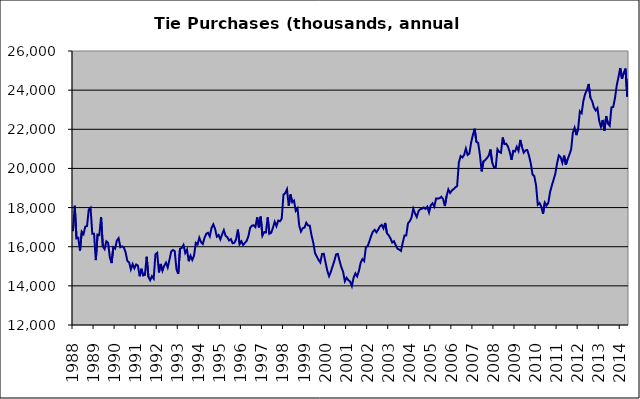
| Category | Series 0 |
|---|---|
| 1988.0 | 16794 |
| nan | 18096 |
| nan | 16425 |
| nan | 16454 |
| nan | 15802 |
| nan | 16769 |
| nan | 16644 |
| nan | 17028 |
| nan | 17057 |
| nan | 17905 |
| nan | 17995 |
| nan | 16665 |
| 1989.0 | 16665 |
| nan | 15316 |
| nan | 16619 |
| nan | 16593 |
| nan | 17519 |
| nan | 16026 |
| nan | 15879 |
| nan | 16277 |
| nan | 16203 |
| nan | 15461 |
| nan | 15163 |
| nan | 15972 |
| 1990.0 | 15899 |
| nan | 16314 |
| nan | 16434 |
| nan | 15977 |
| nan | 16020 |
| nan | 15960 |
| nan | 15711 |
| nan | 15271 |
| nan | 15199 |
| nan | 14844 |
| nan | 15113 |
| nan | 14898 |
| 1991.0 | 15092 |
| nan | 15037 |
| nan | 14492 |
| nan | 14871 |
| nan | 14530 |
| nan | 14562 |
| nan | 15485 |
| nan | 14460 |
| nan | 14286 |
| nan | 14494 |
| nan | 14368 |
| nan | 15613 |
| 1992.0 | 15687 |
| nan | 14688 |
| nan | 15120 |
| nan | 14773 |
| nan | 15028 |
| nan | 15185 |
| nan | 14940 |
| nan | 15334 |
| nan | 15756 |
| nan | 15832 |
| nan | 15770 |
| nan | 14841 |
| 1993.0 | 14611 |
| nan | 15894 |
| nan | 15935 |
| nan | 16089 |
| nan | 15681 |
| nan | 15852 |
| nan | 15260 |
| nan | 15539 |
| nan | 15326 |
| nan | 15535 |
| nan | 16195 |
| nan | 16113 |
| 1994.0 | 16461 |
| nan | 16234 |
| nan | 16139 |
| nan | 16458 |
| nan | 16663 |
| nan | 16714 |
| nan | 16533 |
| nan | 16965 |
| nan | 17141 |
| nan | 16912 |
| nan | 16518 |
| nan | 16600 |
| 1995.0 | 16377 |
| nan | 16627 |
| nan | 16845 |
| nan | 16555 |
| nan | 16483 |
| nan | 16320 |
| nan | 16392 |
| nan | 16177 |
| nan | 16200 |
| nan | 16378 |
| nan | 16874 |
| nan | 16131 |
| 1996.0 | 16274 |
| nan | 16091 |
| nan | 16194 |
| nan | 16295 |
| nan | 16540 |
| nan | 16965 |
| nan | 17074 |
| nan | 17096 |
| nan | 17004 |
| nan | 17502 |
| nan | 16988 |
| nan | 17539 |
| 1997.0 | 16566 |
| nan | 16751 |
| nan | 16730 |
| nan | 17496 |
| nan | 16659 |
| nan | 16714 |
| nan | 16966 |
| nan | 17275 |
| nan | 17050 |
| nan | 17334 |
| nan | 17299 |
| nan | 17439 |
| 1998.0 | 18664 |
| nan | 18734 |
| nan | 18936 |
| nan | 18098 |
| nan | 18667 |
| nan | 18275 |
| nan | 18355 |
| nan | 17838 |
| nan | 17966 |
| nan | 17066 |
| nan | 16772 |
| nan | 16950 |
| 1999.0 | 16977 |
| nan | 17223 |
| nan | 17085 |
| nan | 17076 |
| nan | 16579 |
| nan | 16203 |
| nan | 15678 |
| nan | 15500 |
| nan | 15324 |
| nan | 15196 |
| nan | 15627 |
| nan | 15640 |
| 2000.0 | 15186 |
| nan | 14772 |
| nan | 14494 |
| nan | 14711 |
| nan | 15001 |
| nan | 15277 |
| nan | 15608 |
| nan | 15633.6 |
| nan | 15268 |
| nan | 14952.4 |
| nan | 14714.4 |
| nan | 14235.1 |
| 2001.0 | 14412.1 |
| nan | 14288.1 |
| nan | 14220.1 |
| nan | 13991.1 |
| nan | 14425.1 |
| nan | 14636.1 |
| nan | 14486.1 |
| nan | 14755.5 |
| nan | 15180.1 |
| nan | 15366.7 |
| nan | 15270.7 |
| nan | 15981 |
| 2002.0 | 16029 |
| nan | 16278 |
| nan | 16554 |
| nan | 16772 |
| nan | 16864.779 |
| nan | 16732.143 |
| nan | 16869.773 |
| nan | 17044.272 |
| nan | 17110.816 |
| nan | 16935.357 |
| nan | 17214.632 |
| nan | 16685.945 |
| 2003.0 | 16584.762 |
| nan | 16423.965 |
| nan | 16213.153 |
| nan | 16279.62 |
| nan | 16079.803 |
| nan | 15893.929 |
| nan | 15856.449 |
| nan | 15786.375 |
| nan | 16206.63 |
| nan | 16576.807 |
| nan | 16577.258 |
| nan | 17193.927 |
| 2004.0 | 17300.698 |
| nan | 17486.896 |
| nan | 17943.35 |
| nan | 17698.616 |
| nan | 17520.808 |
| nan | 17820.038 |
| nan | 17913.671 |
| nan | 17943.361 |
| nan | 18006.259 |
| nan | 17933.267 |
| nan | 18045.705 |
| nan | 17749.231 |
| 2005.0 | 18120.293 |
| nan | 18217.964 |
| nan | 18050.513 |
| nan | 18460.353 |
| nan | 18462.346 |
| nan | 18474.613 |
| nan | 18553.183 |
| nan | 18441.251 |
| nan | 18076.596 |
| nan | 18589.667 |
| nan | 18925.778 |
| nan | 18744.891 |
| 2006.0 | 18872.122 |
| nan | 18943.051 |
| nan | 19035 |
| nan | 19096.504 |
| nan | 20301.829 |
| nan | 20633.39 |
| nan | 20558.545 |
| nan | 20688.386 |
| nan | 21013.776 |
| nan | 20688.165 |
| nan | 20761.253 |
| nan | 21332.775 |
| 2007.0 | 21704.659 |
| nan | 22029.336 |
| nan | 21356.246 |
| nan | 21304.71 |
| nan | 20700.172 |
| nan | 19851.439 |
| nan | 20360.531 |
| nan | 20422.597 |
| nan | 20527.979 |
| nan | 20652.564 |
| nan | 20966.065 |
| nan | 20301.696 |
| 2008.0 | 20054.77 |
| nan | 20037.097 |
| nan | 20977.505 |
| nan | 20844.486 |
| nan | 20798.047 |
| nan | 21580.707 |
| nan | 21241.811 |
| nan | 21264.942 |
| nan | 21111.38 |
| nan | 20841.661 |
| nan | 20439.02 |
| nan | 20896.232 |
| 2009.0 | 20863.704 |
| nan | 21104.27 |
| nan | 20898.69 |
| nan | 21455.363 |
| nan | 21078.741 |
| nan | 20806.603 |
| nan | 20920.173 |
| nan | 20941.076 |
| nan | 20648.757 |
| nan | 20256.647 |
| nan | 19692.437 |
| nan | 19604.055 |
| 2010.0 | 19148.944 |
| nan | 18142.822 |
| nan | 18231.973 |
| nan | 18042.422 |
| nan | 17685.593 |
| nan | 18253.454 |
| nan | 18107.794 |
| nan | 18239.4 |
| nan | 18788.04 |
| nan | 19124.813 |
| nan | 19421.05 |
| nan | 19735.982 |
| 2011.0 | 20267.368 |
| nan | 20662.733 |
| nan | 20573.808 |
| nan | 20287.484 |
| nan | 20655.189 |
| nan | 20185.167 |
| nan | 20475.06 |
| nan | 20700.175 |
| nan | 20969.137 |
| nan | 21828.66 |
| nan | 22076.202 |
| nan | 21699.581 |
| 2012.0 | 22034.885 |
| nan | 22917.926 |
| nan | 22823.2 |
| nan | 23452.563 |
| nan | 23806.877 |
| nan | 24003.444 |
| nan | 24316.991 |
| nan | 23613.628 |
| nan | 23434.252 |
| nan | 23117.15 |
| nan | 22963.606 |
| nan | 23081.551 |
| 2013.0 | 22435.959 |
| nan | 22122.495 |
| nan | 22476.498 |
| nan | 21929.786 |
| nan | 22666.032 |
| nan | 22295.532 |
| nan | 22180.968 |
| nan | 23119.766 |
| nan | 23138.87 |
| nan | 23588.791 |
| nan | 24231.321 |
| nan | 24664.451 |
| 2014.0 | 25131.231 |
| nan | 24577.817 |
| nan | 24884.209 |
| nan | 25100.818 |
| nan | 23672.19 |
| nan | 24666.211 |